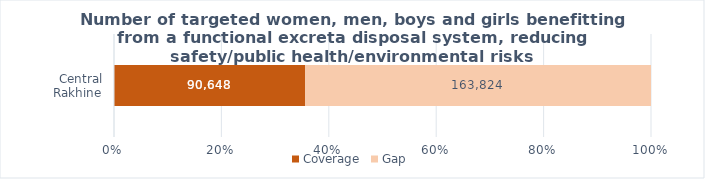
| Category | Coverage | Gap |
|---|---|---|
|  Central Rakhine  | 90648 | 163824 |